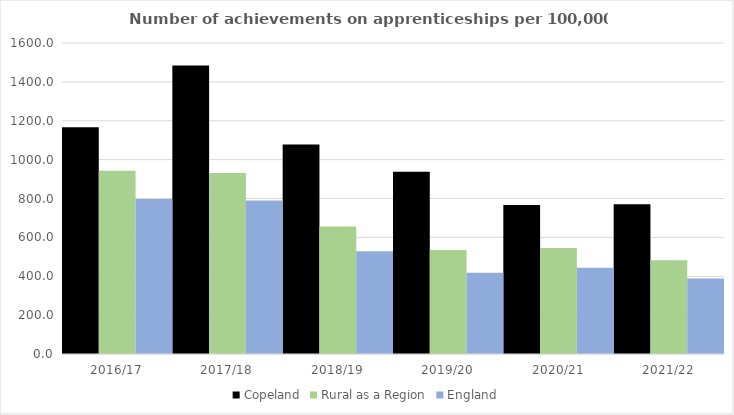
| Category | Copeland | Rural as a Region | England |
|---|---|---|---|
| 2016/17 | 1167 | 942.594 | 797 |
| 2017/18 | 1484 | 931.709 | 790 |
| 2018/19 | 1078 | 656.44 | 528 |
| 2019/20 | 937 | 535.552 | 418 |
| 2020/21 | 766 | 545.333 | 444 |
| 2021/22 | 771 | 482.936 | 389 |